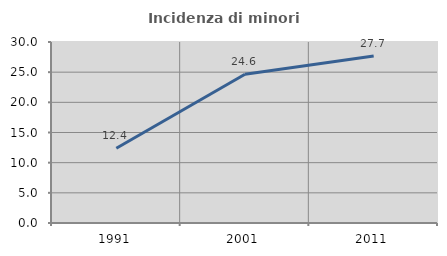
| Category | Incidenza di minori stranieri |
|---|---|
| 1991.0 | 12.381 |
| 2001.0 | 24.645 |
| 2011.0 | 27.675 |